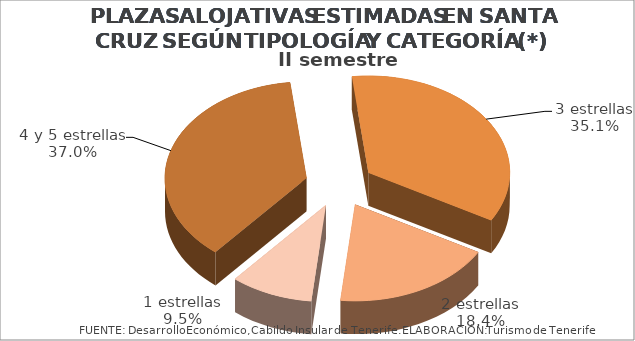
| Category | II semestre 2014 |
|---|---|
| 4 y 5 estrellas | 0.37 |
| 3 estrellas | 0.351 |
| 2 estrellas | 0.184 |
| 1 estrellas | 0.095 |